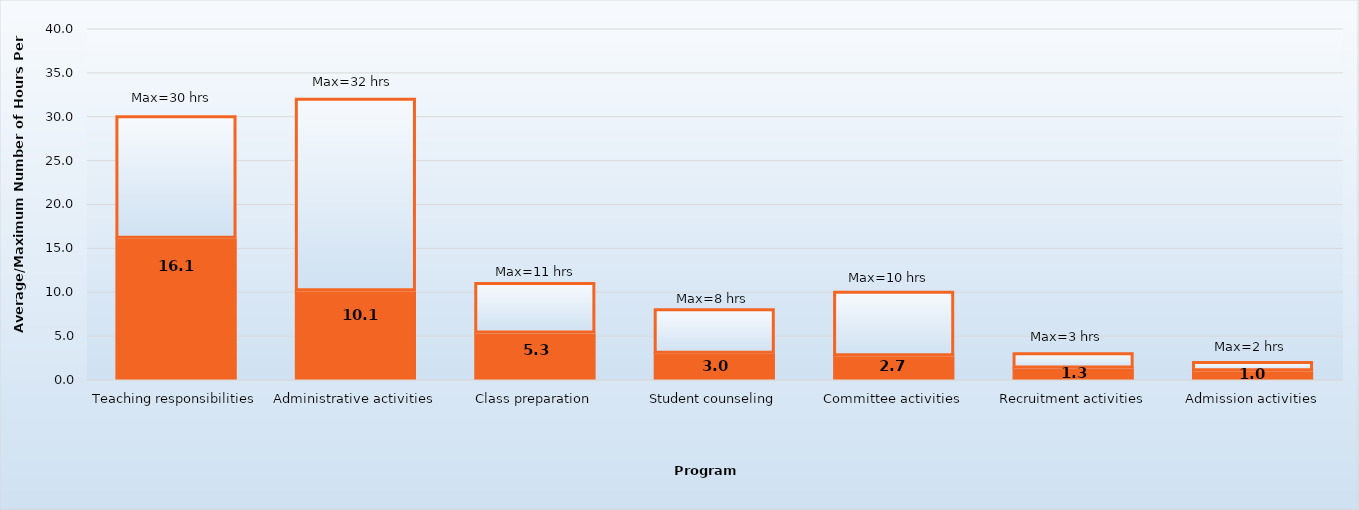
| Category | Average hours per week | Maximum |
|---|---|---|
| Teaching responsibilities | 16.1 | 13.9 |
| Administrative activities | 10.1 | 21.9 |
| Class preparation | 5.3 | 5.7 |
| Student counseling | 3 | 5 |
| Committee activities | 2.7 | 7.3 |
| Recruitment activities | 1.3 | 1.7 |
| Admission activities | 1 | 1 |